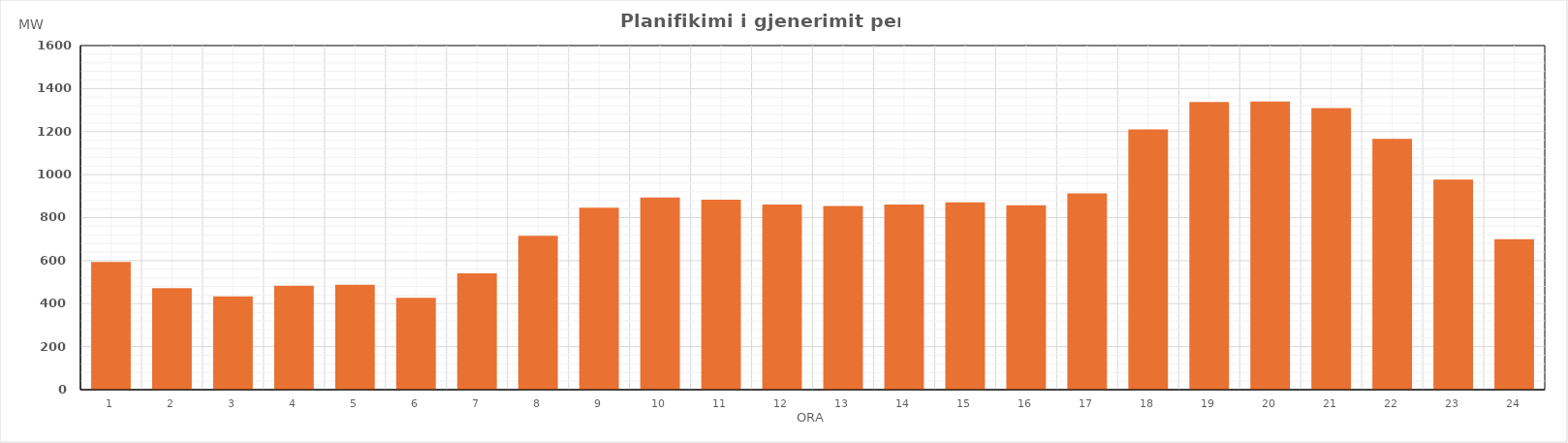
| Category | Max (MW) |
|---|---|
| 0 | 594.19 |
| 1 | 472.46 |
| 2 | 433.88 |
| 3 | 483.87 |
| 4 | 488.36 |
| 5 | 426.67 |
| 6 | 540.82 |
| 7 | 715.08 |
| 8 | 846.17 |
| 9 | 893.83 |
| 10 | 883.72 |
| 11 | 860.46 |
| 12 | 854.24 |
| 13 | 860.94 |
| 14 | 871.12 |
| 15 | 857.82 |
| 16 | 912.99 |
| 17 | 1210.62 |
| 18 | 1337.92 |
| 19 | 1340.12 |
| 20 | 1308.88 |
| 21 | 1165.75 |
| 22 | 976.94 |
| 23 | 699.27 |